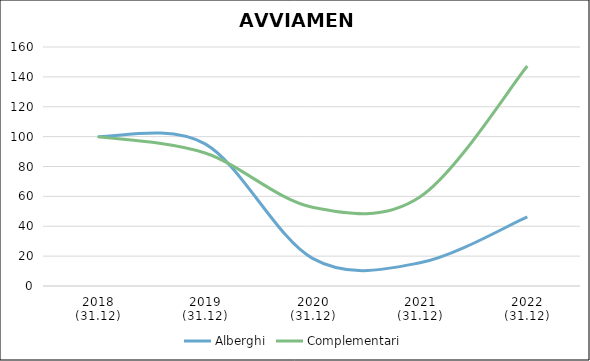
| Category | Alberghi | Complementari |
|---|---|---|
| 2018
(31.12) | 100 | 100 |
| 2019
(31.12) | 95.143 | 89.041 |
| 2020
(31.12) | 18.518 | 52.74 |
| 2021
(31.12) | 15.543 | 59.589 |
| 2022
(31.12) | 46.282 | 147.26 |